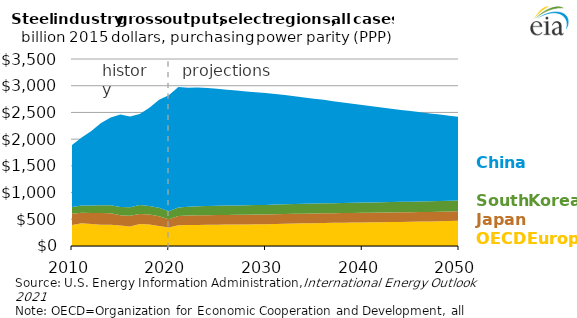
| Category | OECD Europe | Japan | South Korea | China |
|---|---|---|---|---|
| 2010.0 | 391.776 | 210.791 | 125.458 | 1162.402 |
| 2011.0 | 427.122 | 194.726 | 135.509 | 1273.392 |
| 2012.0 | 410.947 | 208.734 | 137.331 | 1395.221 |
| 2013.0 | 399.229 | 220.504 | 140.82 | 1539.77 |
| 2014.0 | 395.476 | 215.189 | 152.327 | 1641.764 |
| 2015.0 | 382.441 | 193.732 | 154.796 | 1730.908 |
| 2016.0 | 363.721 | 200.727 | 159.475 | 1702.004 |
| 2017.0 | 410.203 | 190.122 | 164.767 | 1705.779 |
| 2018.0 | 401.118 | 186.322 | 162.149 | 1836.228 |
| 2019.0 | 375.539 | 181.114 | 161.252 | 2019.518 |
| 2020.0 | 346.038 | 155.068 | 147.409 | 2171.569 |
| 2021.0 | 386.143 | 174.911 | 161.559 | 2252.163 |
| 2022.0 | 391.428 | 178.268 | 165.02 | 2227.842 |
| 2023.0 | 395.211 | 180.284 | 169.681 | 2220.315 |
| 2024.0 | 397.087 | 180.761 | 171.908 | 2205.754 |
| 2025.0 | 398.75 | 181.54 | 173.378 | 2187.779 |
| 2026.0 | 400.408 | 182.085 | 174.436 | 2169.456 |
| 2027.0 | 401.816 | 182.065 | 175.506 | 2150.765 |
| 2028.0 | 403.419 | 181.933 | 176.724 | 2131.951 |
| 2029.0 | 405.555 | 181.815 | 178.041 | 2113.209 |
| 2030.0 | 408.109 | 181.67 | 179.496 | 2093.51 |
| 2031.0 | 412.034 | 181.555 | 181.254 | 2071.138 |
| 2032.0 | 415.984 | 181.422 | 182.18 | 2045.241 |
| 2033.0 | 419.891 | 181.443 | 182.966 | 2018.072 |
| 2034.0 | 423.916 | 181.394 | 184.005 | 1990.814 |
| 2035.0 | 427.679 | 181.163 | 185.29 | 1963.908 |
| 2036.0 | 431.086 | 180.702 | 186.506 | 1936.958 |
| 2037.0 | 434.296 | 180.157 | 187.516 | 1909.013 |
| 2038.0 | 437.141 | 179.693 | 188.425 | 1880.919 |
| 2039.0 | 439.687 | 179.454 | 189.509 | 1853.016 |
| 2040.0 | 441.944 | 179.197 | 190.821 | 1825.493 |
| 2041.0 | 444.005 | 179.034 | 192.417 | 1798.249 |
| 2042.0 | 446.094 | 178.892 | 194.053 | 1771.777 |
| 2043.0 | 448.381 | 178.708 | 195.564 | 1745.905 |
| 2044.0 | 450.893 | 178.54 | 196.993 | 1719.93 |
| 2045.0 | 453.668 | 178.423 | 198.329 | 1694.035 |
| 2046.0 | 456.721 | 178.32 | 199.529 | 1668.097 |
| 2047.0 | 460.097 | 178.206 | 200.704 | 1641.899 |
| 2048.0 | 463.755 | 178.119 | 201.986 | 1615.864 |
| 2049.0 | 467.581 | 178.024 | 203.353 | 1590.005 |
| 2050.0 | 471.375 | 177.925 | 204.876 | 1564.244 |